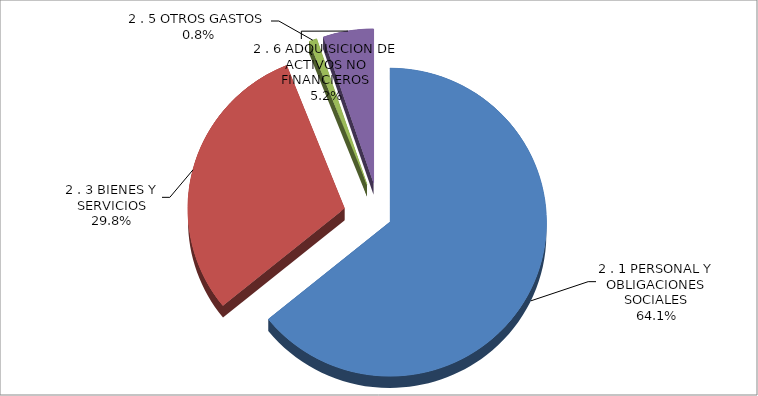
| Category | Series 0 |
|---|---|
| 2 . 1 PERSONAL Y OBLIGACIONES SOCIALES | 50772153 |
| 2 . 3 BIENES Y SERVICIOS | 23607721 |
| 2 . 5 OTROS GASTOS | 646943 |
| 2 . 6 ADQUISICION DE ACTIVOS NO FINANCIEROS | 4128694 |